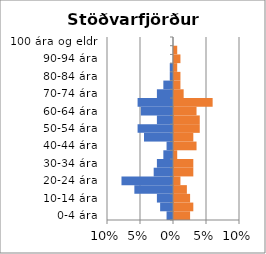
| Category | % karlar | %konur |
|---|---|---|
| 0-4 ára | -0.01 | 0.024 |
| 5-9 ára | -0.02 | 0.029 |
| 10-14 ára | -0.024 | 0.024 |
| 15-19 ára | -0.059 | 0.02 |
| 20-24 ára | -0.078 | 0.01 |
| 25-29 ára | -0.029 | 0.029 |
| 30-34 ára | -0.024 | 0.029 |
| 35-39 ára | -0.015 | 0.005 |
| 40-44 ára | -0.01 | 0.034 |
| 45-49 ára | -0.044 | 0.029 |
| 50-54 ára | -0.054 | 0.039 |
| 55-59 ára | -0.024 | 0.039 |
| 60-64 ára | -0.049 | 0.034 |
| 65-69 ára | -0.054 | 0.059 |
| 70-74 ára | -0.024 | 0.015 |
| 75-79 ára | -0.015 | 0.01 |
| 80-84 ára | -0.005 | 0.01 |
| 85-89 ára | -0.005 | 0.005 |
| 90-94 ára | 0 | 0.01 |
| 95-99 ára | 0 | 0.005 |
| 100 ára og eldri | 0 | 0 |